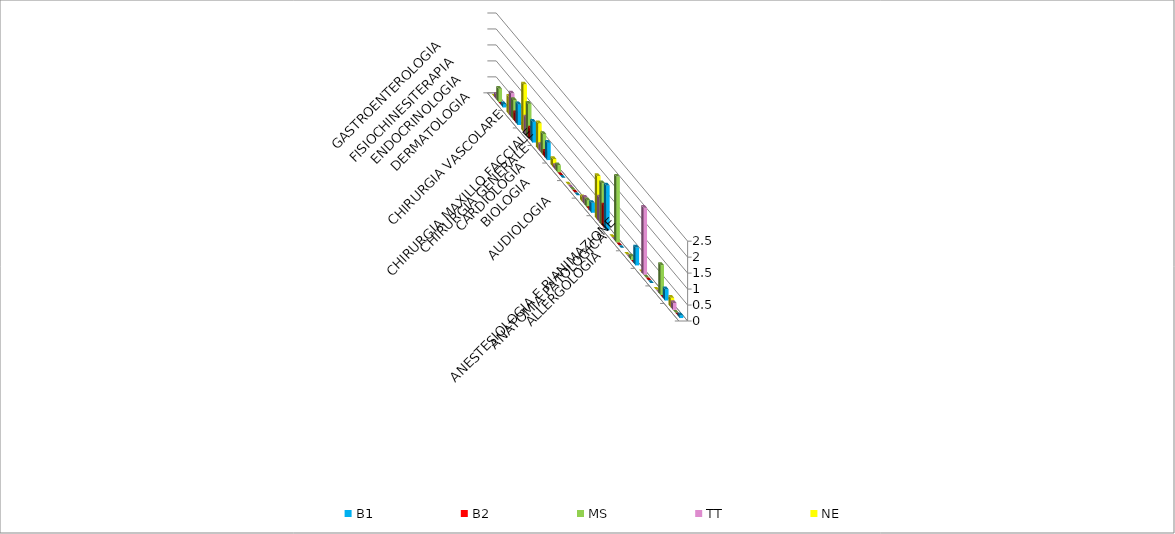
| Category | B1 | B2 | MS | TT | NE |
|---|---|---|---|---|---|
| ALLERGOLOGIA | 0.089 | 0 | 0 | 0.221 | 0.297 |
| ANATOMIA PATOLOGICA | 0.355 | 0 | 0.941 | 0 | 0 |
| ANESTESIOLOGIA E RIANIMAZIONE | 0 | 0 | 0 | 2.103 | 0 |
| AUDIOLOGIA | 0.562 | 0 | 0.109 | 0 | 0 |
| BIOLOGIA | 0 | 0 | 2.062 | 0 | 0 |
| CARDIOLOGIA | 1.405 | 0.69 | 1.302 | 0.775 | 1.361 |
| CHIRURGIA GENERALE | 0.31 | 0.035 | 0.226 | 0.221 | 0.148 |
| CHIRURGIA MAXILLO FACCIALE | 0 | 0 | 0 | 0 | 0 |
| CHIRURGIA VASCOLARE | 0 | 0 | 0.217 | 0.111 | 0.247 |
| DERMATOLOGIA | 0.547 | 0.177 | 0.651 | 0.221 | 0.816 |
| ENDOCRINOLOGIA | 0.651 | 0.354 | 1.049 | 0.535 | 1.484 |
| FISIOCHINESITERAPIA | 0.651 | 0.283 | 0.615 | 0.738 | 0.544 |
| GASTROENTEROLOGIA | 0.103 | 0 | 0.416 | 0.148 | 0 |